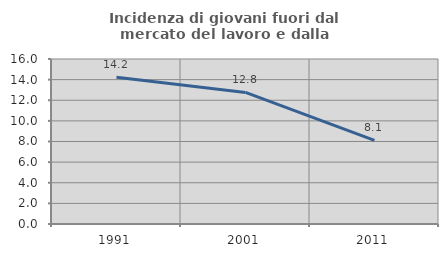
| Category | Incidenza di giovani fuori dal mercato del lavoro e dalla formazione  |
|---|---|
| 1991.0 | 14.232 |
| 2001.0 | 12.76 |
| 2011.0 | 8.118 |